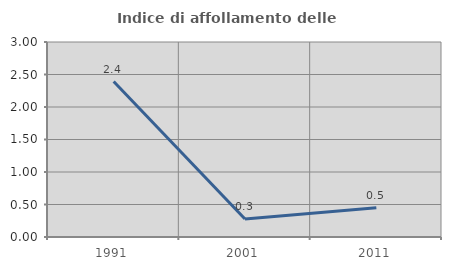
| Category | Indice di affollamento delle abitazioni  |
|---|---|
| 1991.0 | 2.391 |
| 2001.0 | 0.277 |
| 2011.0 | 0.451 |